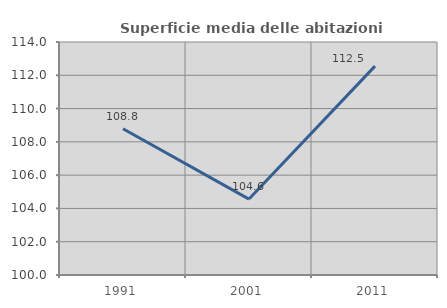
| Category | Superficie media delle abitazioni occupate |
|---|---|
| 1991.0 | 108.786 |
| 2001.0 | 104.562 |
| 2011.0 | 112.55 |